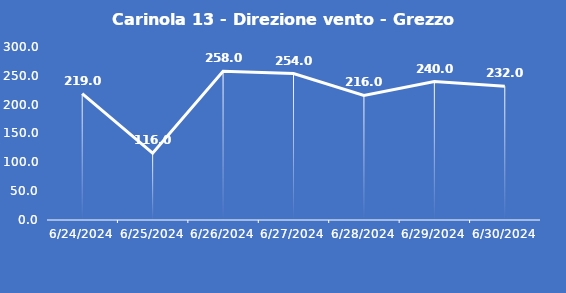
| Category | Carinola 13 - Direzione vento - Grezzo (°N) |
|---|---|
| 6/24/24 | 219 |
| 6/25/24 | 116 |
| 6/26/24 | 258 |
| 6/27/24 | 254 |
| 6/28/24 | 216 |
| 6/29/24 | 240 |
| 6/30/24 | 232 |